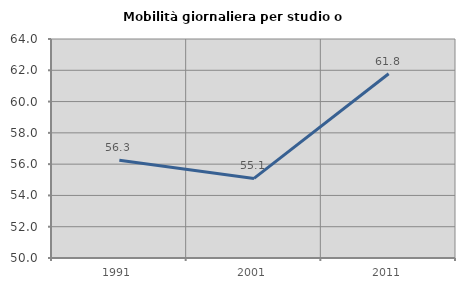
| Category | Mobilità giornaliera per studio o lavoro |
|---|---|
| 1991.0 | 56.25 |
| 2001.0 | 55.088 |
| 2011.0 | 61.775 |